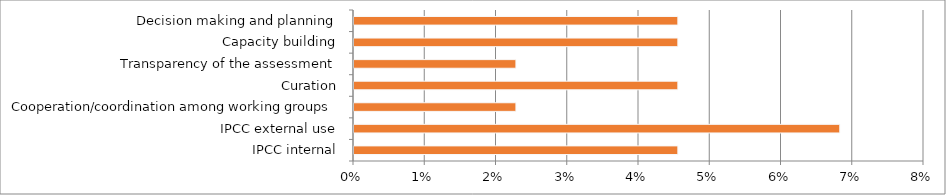
| Category | Series 0 |
|---|---|
| IPCC internal | 0.045 |
| IPCC external use | 0.068 |
| Cooperation/coordination among working groups | 0.023 |
| Curation | 0.045 |
| Transparency of the assessment | 0.023 |
| Capacity building | 0.045 |
| Decision making and planning | 0.045 |